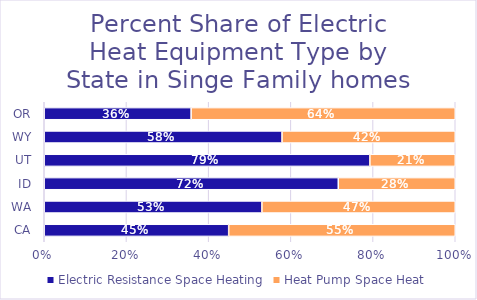
| Category | Electric Resistance Space Heating | Heat Pump Space Heat |
|---|---|---|
| CA | 0.449 | 0.551 |
| WA | 0.53 | 0.47 |
| ID | 0.715 | 0.285 |
| UT | 0.792 | 0.208 |
| WY | 0.579 | 0.421 |
| OR | 0.357 | 0.643 |